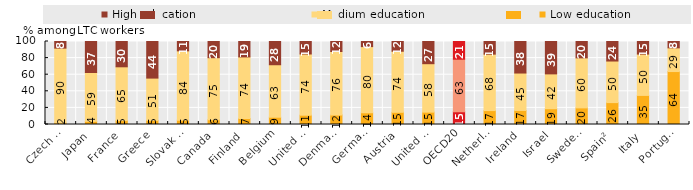
| Category | Low education | Medium education | High education |
|---|---|---|---|
| Czech Republic¹ | 1.918 | 90.097 | 7.986 |
| Japan | 3.778 | 58.867 | 37.356 |
| France | 4.688 | 64.825 | 30.487 |
| Greece | 4.9 | 51.003 | 44.097 |
| Slovak Republic² | 5.222 | 83.505 | 11.273 |
| Canada | 5.7 | 74.8 | 19.5 |
| Finland | 7.256 | 74.181 | 18.563 |
| Belgium | 8.782 | 63.223 | 27.995 |
| United States | 11.204 | 73.752 | 15.044 |
| Denmark | 11.569 | 76.415 | 12.017 |
| Germany | 14.085 | 79.764 | 6.151 |
| Austria | 14.685 | 73.591 | 11.724 |
| United Kingdom² | 14.889 | 58.366 | 26.745 |
| OECD20 | 15.33 | 63.31 | 21.36 |
| Netherlands | 16.763 | 68.001 | 15.236 |
| Ireland | 16.936 | 45.075 | 37.99 |
| Israel | 19 | 42 | 39 |
| Sweden² | 20.022 | 60.276 | 19.702 |
| Spain² | 26.376 | 50.097 | 23.527 |
| Italy | 35.03 | 49.816 | 15.154 |
| Portugal² | 63.797 | 28.545 | 7.658 |